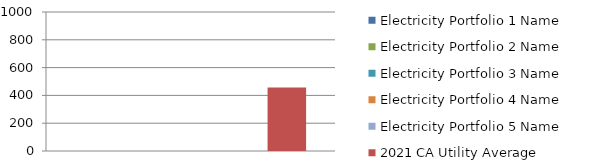
| Category | Electricity Portfolio 1 Name | Electricity Portfolio 2 Name | Electricity Portfolio 3 Name | Electricity Portfolio 4 Name | Electricity Portfolio 5 Name | 2021 CA Utility Average |
|---|---|---|---|---|---|---|
| 0 | 0 | 0 | 0 | 0 | 0 | 456 |